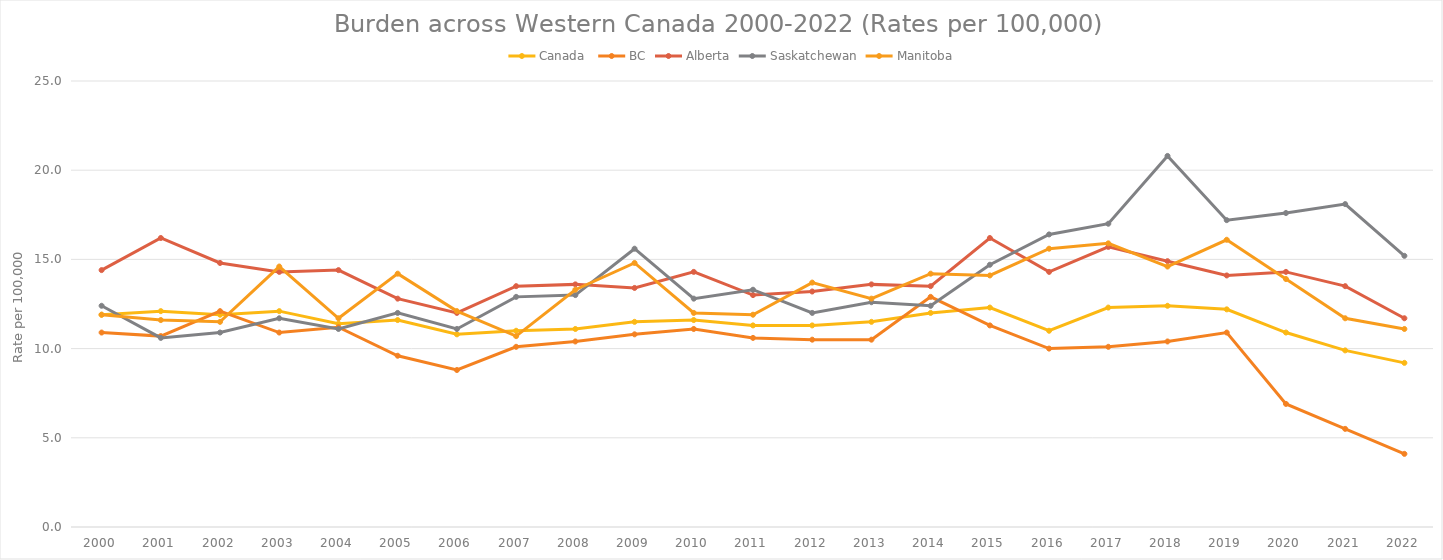
| Category | Canada  | BC | Alberta | Saskatchewan | Manitoba |
|---|---|---|---|---|---|
| 2000.0 | 11.9 | 10.9 | 14.4 | 12.4 | 11.9 |
| 2001.0 | 12.1 | 10.7 | 16.2 | 10.6 | 11.6 |
| 2002.0 | 11.9 | 12.1 | 14.8 | 10.9 | 11.5 |
| 2003.0 | 12.1 | 10.9 | 14.3 | 11.7 | 14.6 |
| 2004.0 | 11.4 | 11.2 | 14.4 | 11.1 | 11.7 |
| 2005.0 | 11.6 | 9.6 | 12.8 | 12 | 14.2 |
| 2006.0 | 10.8 | 8.8 | 12 | 11.1 | 12.1 |
| 2007.0 | 11 | 10.1 | 13.5 | 12.9 | 10.7 |
| 2008.0 | 11.1 | 10.4 | 13.6 | 13 | 13.3 |
| 2009.0 | 11.5 | 10.8 | 13.4 | 15.6 | 14.8 |
| 2010.0 | 11.6 | 11.1 | 14.3 | 12.8 | 12 |
| 2011.0 | 11.3 | 10.6 | 13 | 13.3 | 11.9 |
| 2012.0 | 11.3 | 10.5 | 13.2 | 12 | 13.7 |
| 2013.0 | 11.5 | 10.5 | 13.6 | 12.6 | 12.8 |
| 2014.0 | 12 | 12.9 | 13.5 | 12.4 | 14.2 |
| 2015.0 | 12.3 | 11.3 | 16.2 | 14.7 | 14.1 |
| 2016.0 | 11 | 10 | 14.3 | 16.4 | 15.6 |
| 2017.0 | 12.3 | 10.1 | 15.7 | 17 | 15.9 |
| 2018.0 | 12.4 | 10.4 | 14.9 | 20.8 | 14.6 |
| 2019.0 | 12.2 | 10.9 | 14.1 | 17.2 | 16.1 |
| 2020.0 | 10.9 | 6.9 | 14.3 | 17.6 | 13.9 |
| 2021.0 | 9.9 | 5.5 | 13.5 | 18.1 | 11.7 |
| 2022.0 | 9.2 | 4.1 | 11.7 | 15.2 | 11.1 |